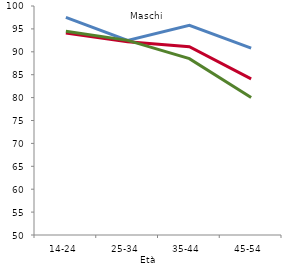
| Category | <=3 anni | 4-5 anni | 6+ anni |
|---|---|---|---|
| 14-24 | 97.5 | 94.1 | 94.5 |
| 25-34 | 92.5 | 92.2 | 92.5 |
| 35-44 | 95.8 | 91.1 | 88.5 |
| 45-54 | 90.8 | 84.1 | 80 |